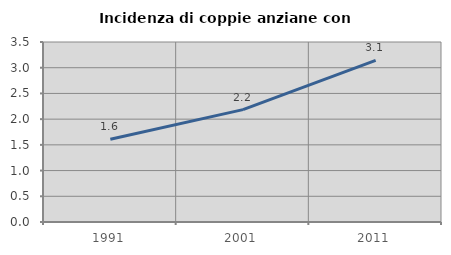
| Category | Incidenza di coppie anziane con figli |
|---|---|
| 1991.0 | 1.608 |
| 2001.0 | 2.185 |
| 2011.0 | 3.143 |